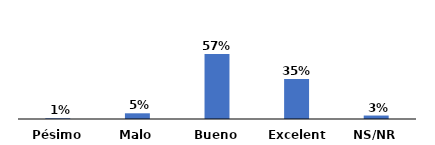
| Category | Series 0 |
|---|---|
| Pésimo | 0.006 |
| Malo | 0.05 |
| Bueno | 0.565 |
| Excelente | 0.349 |
| NS/NR | 0.03 |